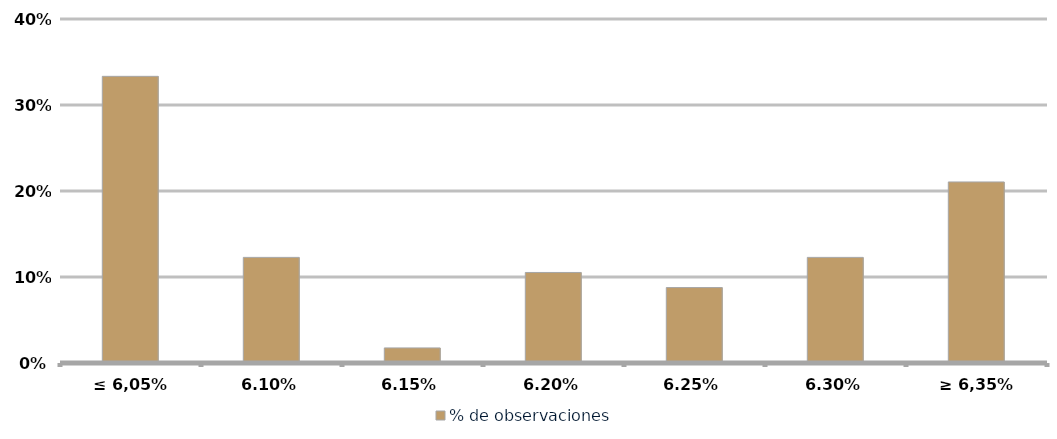
| Category | % de observaciones  |
|---|---|
| ≤ 6,05% | 0.333 |
| 6,10% | 0.123 |
| 6,15% | 0.018 |
| 6,20% | 0.105 |
| 6,25% | 0.088 |
| 6,30% | 0.123 |
| ≥ 6,35% | 0.211 |